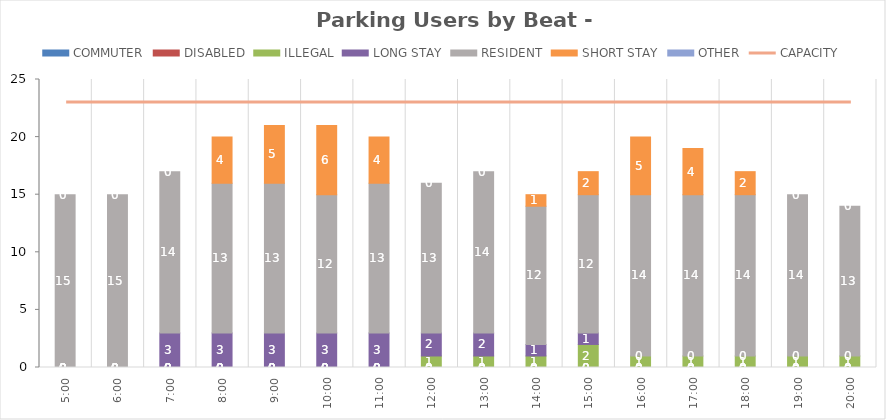
| Category | COMMUTER | DISABLED | ILLEGAL | LONG STAY | RESIDENT | SHORT STAY | OTHER |
|---|---|---|---|---|---|---|---|
| 0.20833333333333334 | 0 | 0 | 0 | 0 | 15 | 0 | 0 |
| 0.25 | 0 | 0 | 0 | 0 | 15 | 0 | 0 |
| 0.2916666666666667 | 0 | 0 | 0 | 3 | 14 | 0 | 0 |
| 0.3333333333333333 | 0 | 0 | 0 | 3 | 13 | 4 | 0 |
| 0.375 | 0 | 0 | 0 | 3 | 13 | 5 | 0 |
| 0.4166666666666667 | 0 | 0 | 0 | 3 | 12 | 6 | 0 |
| 0.4583333333333333 | 0 | 0 | 0 | 3 | 13 | 4 | 0 |
| 0.5 | 0 | 0 | 1 | 2 | 13 | 0 | 0 |
| 0.5416666666666666 | 0 | 0 | 1 | 2 | 14 | 0 | 0 |
| 0.5833333333333334 | 0 | 0 | 1 | 1 | 12 | 1 | 0 |
| 0.625 | 0 | 0 | 2 | 1 | 12 | 2 | 0 |
| 0.6666666666666666 | 0 | 0 | 1 | 0 | 14 | 5 | 0 |
| 0.7083333333333334 | 0 | 0 | 1 | 0 | 14 | 4 | 0 |
| 0.75 | 0 | 0 | 1 | 0 | 14 | 2 | 0 |
| 0.7916666666666666 | 0 | 0 | 1 | 0 | 14 | 0 | 0 |
| 0.8333333333333334 | 0 | 0 | 1 | 0 | 13 | 0 | 0 |